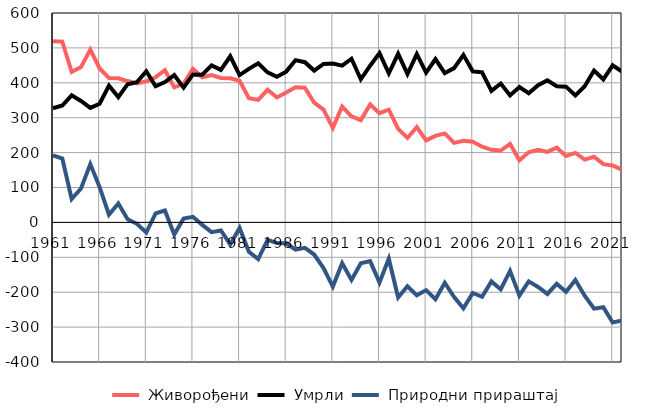
| Category |  Живорођени |  Умрли |  Природни прираштај |
|---|---|---|---|
| 1961.0 | 519 | 327 | 192 |
| 1962.0 | 518 | 335 | 183 |
| 1963.0 | 431 | 364 | 67 |
| 1964.0 | 445 | 348 | 97 |
| 1965.0 | 495 | 328 | 167 |
| 1966.0 | 441 | 340 | 101 |
| 1967.0 | 414 | 392 | 22 |
| 1968.0 | 413 | 359 | 54 |
| 1969.0 | 405 | 396 | 9 |
| 1970.0 | 398 | 402 | -4 |
| 1971.0 | 404 | 433 | -29 |
| 1972.0 | 416 | 390 | 26 |
| 1973.0 | 436 | 402 | 34 |
| 1974.0 | 387 | 422 | -35 |
| 1975.0 | 397 | 386 | 11 |
| 1976.0 | 440 | 424 | 16 |
| 1977.0 | 416 | 423 | -7 |
| 1978.0 | 422 | 450 | -28 |
| 1979.0 | 414 | 437 | -23 |
| 1980.0 | 413 | 476 | -63 |
| 1981.0 | 406 | 422 | -16 |
| 1982.0 | 356 | 440 | -84 |
| 1983.0 | 351 | 456 | -105 |
| 1984.0 | 380 | 430 | -50 |
| 1985.0 | 358 | 417 | -59 |
| 1986.0 | 372 | 432 | -60 |
| 1987.0 | 387 | 465 | -78 |
| 1988.0 | 386 | 459 | -73 |
| 1989.0 | 343 | 435 | -92 |
| 1990.0 | 323 | 454 | -131 |
| 1991.0 | 271 | 455 | -184 |
| 1992.0 | 332 | 449 | -117 |
| 1993.0 | 304 | 469 | -165 |
| 1994.0 | 293 | 410 | -117 |
| 1995.0 | 338 | 449 | -111 |
| 1996.0 | 313 | 485 | -172 |
| 1997.0 | 323 | 427 | -104 |
| 1998.0 | 268 | 483 | -215 |
| 1999.0 | 242 | 425 | -183 |
| 2000.0 | 273 | 482 | -209 |
| 2001.0 | 235 | 429 | -194 |
| 2002.0 | 248 | 468 | -220 |
| 2003.0 | 255 | 428 | -173 |
| 2004.0 | 228 | 442 | -214 |
| 2005.0 | 234 | 480 | -246 |
| 2006.0 | 231 | 433 | -202 |
| 2007.0 | 217 | 430 | -213 |
| 2008.0 | 208 | 377 | -169 |
| 2009.0 | 206 | 398 | -192 |
| 2010.0 | 225 | 364 | -139 |
| 2011.0 | 178 | 388 | -210 |
| 2012.0 | 201 | 370 | -169 |
| 2013.0 | 208 | 393 | -185 |
| 2014.0 | 202 | 407 | -205 |
| 2015.0 | 214 | 390 | -176 |
| 2016.0 | 190 | 389 | -199 |
| 2017.0 | 199 | 364 | -165 |
| 2018.0 | 180 | 390 | -210 |
| 2019.0 | 188 | 435 | -247 |
| 2020.0 | 167 | 410 | -243 |
| 2021.0 | 163 | 450 | -287 |
| 2022.0 | 151 | 432 | -281 |